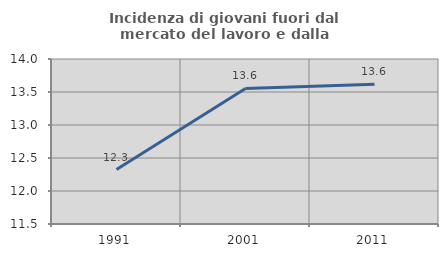
| Category | Incidenza di giovani fuori dal mercato del lavoro e dalla formazione  |
|---|---|
| 1991.0 | 12.326 |
| 2001.0 | 13.553 |
| 2011.0 | 13.617 |